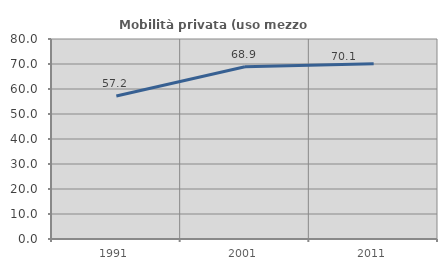
| Category | Mobilità privata (uso mezzo privato) |
|---|---|
| 1991.0 | 57.193 |
| 2001.0 | 68.914 |
| 2011.0 | 70.06 |